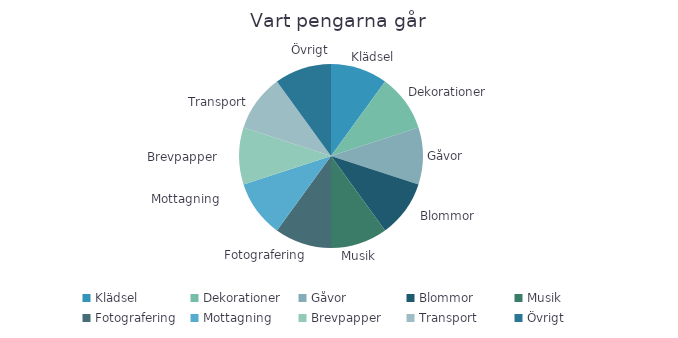
| Category | Belopp |
|---|---|
| Klädsel | 1 |
| Dekorationer | 1 |
| Gåvor | 1 |
| Blommor | 1 |
| Musik | 1 |
| Fotografering | 1 |
| Mottagning | 1 |
| Brevpapper | 1 |
| Transport | 1 |
| Övrigt | 1 |